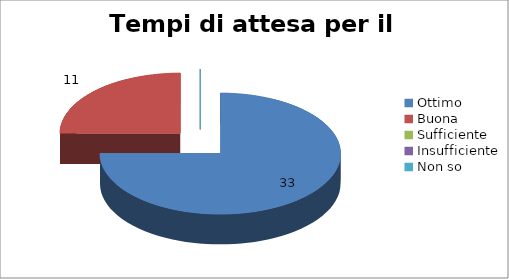
| Category | Tempi di attesa per il prelievo |
|---|---|
| Ottimo | 33 |
| Buona | 11 |
| Sufficiente | 0 |
| Insufficiente | 0 |
| Non so | 0 |